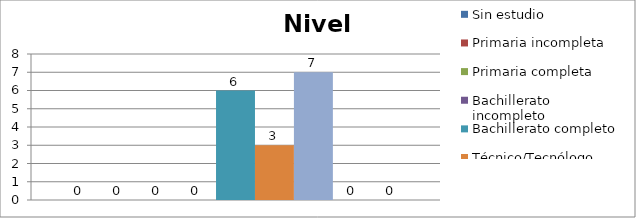
| Category | Sin estudio | Primaria incompleta | Primaria completa | Bachillerato incompleto | Bachillerato completo | Técnico/Tecnólogo | Universitario | Post-grado | Especialización |
|---|---|---|---|---|---|---|---|---|---|
| 0 |  | 0 | 0 | 0 | 6 | 3 | 7 | 0 | 0 |